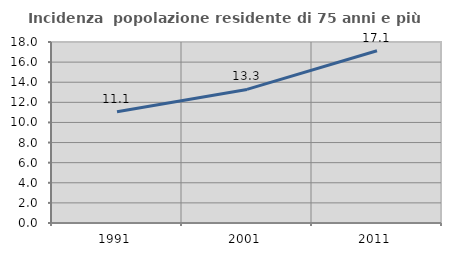
| Category | Incidenza  popolazione residente di 75 anni e più |
|---|---|
| 1991.0 | 11.055 |
| 2001.0 | 13.286 |
| 2011.0 | 17.127 |